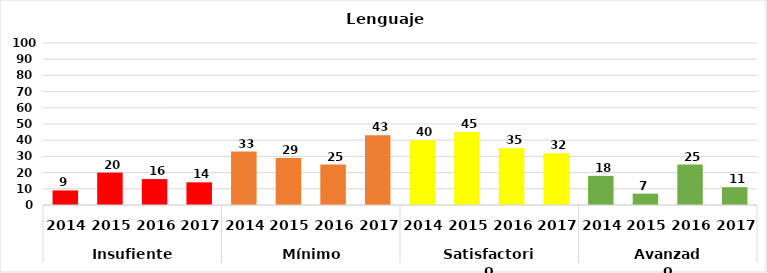
| Category | Series 0 |
|---|---|
| 0 | 9 |
| 1 | 20 |
| 2 | 16 |
| 3 | 14 |
| 4 | 33 |
| 5 | 29 |
| 6 | 25 |
| 7 | 43 |
| 8 | 40 |
| 9 | 45 |
| 10 | 35 |
| 11 | 32 |
| 12 | 18 |
| 13 | 7 |
| 14 | 25 |
| 15 | 11 |